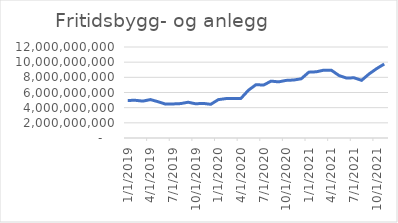
| Category | Fritidsbygg- og anlegg |
|---|---|
| 1/1/19 | 4952650333.333 |
| 2/1/19 | 4970858666.667 |
| 3/1/19 | 4864992000 |
| 4/1/19 | 5064392000 |
| 5/1/19 | 4791362833.333 |
| 6/1/19 | 4466594500 |
| 7/1/19 | 4490988750 |
| 8/1/19 | 4536924166.667 |
| 9/1/19 | 4715088333.333 |
| 10/1/19 | 4513615000 |
| 11/1/19 | 4565385833.333 |
| 12/1/19 | 4442100000 |
| 1/1/20 | 5056465000 |
| 2/1/20 | 5197040000 |
| 3/1/20 | 5219420833.333 |
| 4/1/20 | 5222040000 |
| 5/1/20 | 6300748333.333 |
| 6/1/20 | 7034370833.333 |
| 7/1/20 | 6980034166.667 |
| 8/1/20 | 7498759166.667 |
| 9/1/20 | 7402822500 |
| 10/1/20 | 7596526666.667 |
| 11/1/20 | 7647381666.667 |
| 12/1/20 | 7809466666.667 |
| 1/1/21 | 8680943333.333 |
| 2/1/21 | 8730685000 |
| 3/1/21 | 8949683333.333 |
| 4/1/21 | 8929898333.333 |
| 5/1/21 | 8242756666.667 |
| 6/1/21 | 7907057916.667 |
| 7/1/21 | 7939715416.667 |
| 8/1/21 | 7604148750 |
| 9/1/21 | 8453881250 |
| 10/1/21 | 9150685416.667 |
| 11/1/21 | 9754513750 |